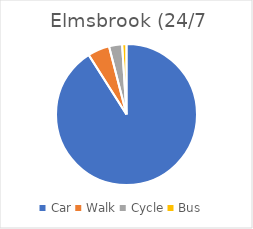
| Category | Series 0 |
|---|---|
| Car | 91 |
| Walk | 5 |
| Cycle | 3 |
| Bus | 1 |